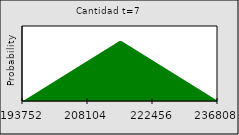
| Category | Series 0 |
|---|---|
| 193752.128872723 | 0 |
| nan | 0 |
| nan | 0.001 |
| nan | 0.001 |
| nan | 0.002 |
| nan | 0.002 |
| nan | 0.002 |
| nan | 0.003 |
| nan | 0.003 |
| nan | 0.004 |
| nan | 0.004 |
| nan | 0.004 |
| nan | 0.005 |
| nan | 0.005 |
| nan | 0.006 |
| nan | 0.006 |
| nan | 0.007 |
| nan | 0.007 |
| nan | 0.007 |
| nan | 0.008 |
| nan | 0.008 |
| nan | 0.009 |
| nan | 0.009 |
| nan | 0.009 |
| nan | 0.01 |
| nan | 0.01 |
| nan | 0.011 |
| nan | 0.011 |
| nan | 0.011 |
| nan | 0.012 |
| nan | 0.012 |
| nan | 0.013 |
| nan | 0.013 |
| 208104.13841885066 | 0.013 |
| nan | 0.014 |
| nan | 0.014 |
| nan | 0.015 |
| nan | 0.015 |
| nan | 0.016 |
| nan | 0.016 |
| nan | 0.016 |
| nan | 0.017 |
| nan | 0.017 |
| nan | 0.018 |
| nan | 0.018 |
| nan | 0.018 |
| nan | 0.019 |
| nan | 0.019 |
| nan | 0.02 |
| nan | 0.02 |
| nan | 0.02 |
| nan | 0.02 |
| nan | 0.019 |
| nan | 0.019 |
| nan | 0.018 |
| nan | 0.018 |
| nan | 0.018 |
| nan | 0.017 |
| nan | 0.017 |
| nan | 0.016 |
| nan | 0.016 |
| nan | 0.016 |
| nan | 0.015 |
| nan | 0.015 |
| nan | 0.014 |
| nan | 0.014 |
| 222456.14796497833 | 0.013 |
| nan | 0.013 |
| nan | 0.013 |
| nan | 0.012 |
| nan | 0.012 |
| nan | 0.011 |
| nan | 0.011 |
| nan | 0.011 |
| nan | 0.01 |
| nan | 0.01 |
| nan | 0.009 |
| nan | 0.009 |
| nan | 0.009 |
| nan | 0.008 |
| nan | 0.008 |
| nan | 0.007 |
| nan | 0.007 |
| nan | 0.007 |
| nan | 0.006 |
| nan | 0.006 |
| nan | 0.005 |
| nan | 0.005 |
| nan | 0.004 |
| nan | 0.004 |
| nan | 0.004 |
| nan | 0.003 |
| nan | 0.003 |
| nan | 0.002 |
| nan | 0.002 |
| nan | 0.002 |
| nan | 0.001 |
| nan | 0.001 |
| nan | 0 |
| 236808.157511106 | 0 |